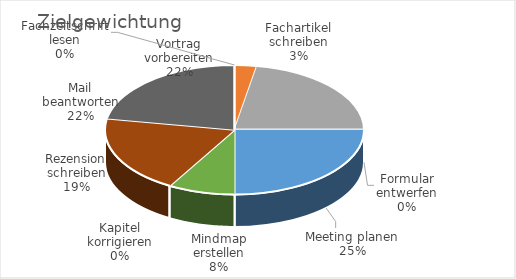
| Category | Series 0 |
|---|---|
| Fachzeitschrift lesen | 0 |
| Fachartikel schreiben | 1 |
| Vortrag vorbereiten | 8 |
| Formular entwerfen | 0 |
| Meeting planen | 9 |
| Mindmap erstellen | 3 |
| Kapitel korrigieren | 0 |
| Rezension schreiben | 7 |
| Mail beantworten | 8 |